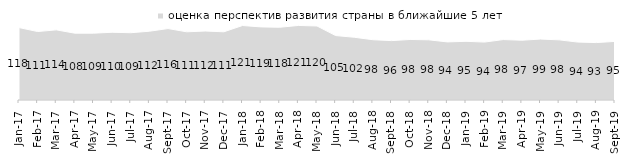
| Category | оценка перспектив развития страны в ближайшие 5 лет |
|---|---|
| 2017-01-01 | 117.55 |
| 2017-02-01 | 111.15 |
| 2017-03-01 | 113.85 |
| 2017-04-01 | 108.45 |
| 2017-05-01 | 108.5 |
| 2017-06-01 | 109.95 |
| 2017-07-01 | 109.2 |
| 2017-08-01 | 111.65 |
| 2017-09-01 | 115.95 |
| 2017-10-01 | 110.7 |
| 2017-11-01 | 111.95 |
| 2017-12-01 | 110.7 |
| 2018-01-01 | 120.9 |
| 2018-02-01 | 118.65 |
| 2018-03-01 | 118.1 |
| 2018-04-01 | 121 |
| 2018-05-01 | 120.15 |
| 2018-06-01 | 104.6 |
| 2018-07-01 | 101.85 |
| 2018-08-01 | 97.85 |
| 2018-09-01 | 96.4 |
| 2018-10-01 | 98.25 |
| 2018-11-01 | 97.705 |
| 2018-12-01 | 94.3 |
| 2019-01-01 | 95.25 |
| 2019-02-01 | 94.05 |
| 2019-03-01 | 98.11 |
| 2019-04-01 | 97.03 |
| 2019-05-01 | 98.91 |
| 2019-06-01 | 97.656 |
| 2019-07-01 | 94.01 |
| 2019-08-01 | 93.207 |
| 2019-09-01 | 95.099 |